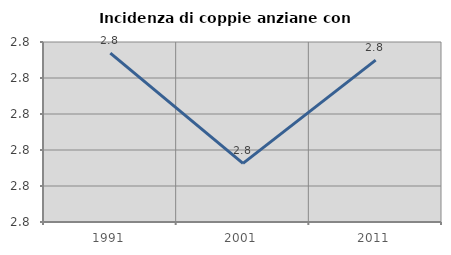
| Category | Incidenza di coppie anziane con figli |
|---|---|
| 1991.0 | 2.817 |
| 2001.0 | 2.786 |
| 2011.0 | 2.815 |